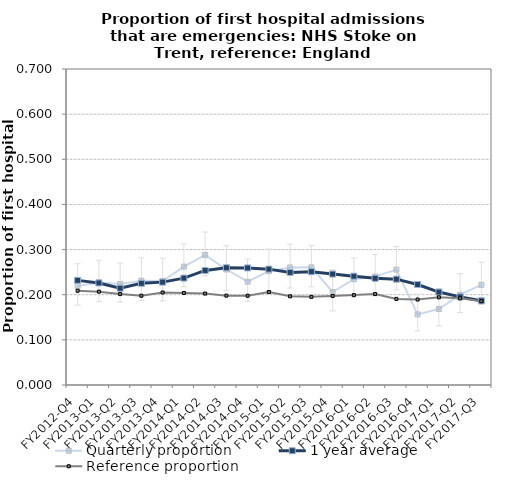
| Category | Quarterly proportion | 1 year average | Reference proportion |
|---|---|---|---|
| FY2012-Q4 | 0.219 | 0.232 | 0.209 |
| FY2013-Q1 | 0.227 | 0.226 | 0.207 |
| FY2013-Q2 | 0.224 | 0.214 | 0.201 |
| FY2013-Q3 | 0.231 | 0.225 | 0.198 |
| FY2013-Q4 | 0.23 | 0.228 | 0.205 |
| FY2014-Q1 | 0.262 | 0.237 | 0.204 |
| FY2014-Q2 | 0.288 | 0.254 | 0.203 |
| FY2014-Q3 | 0.256 | 0.26 | 0.198 |
| FY2014-Q4 | 0.229 | 0.259 | 0.198 |
| FY2015-Q1 | 0.252 | 0.257 | 0.206 |
| FY2015-Q2 | 0.26 | 0.249 | 0.196 |
| FY2015-Q3 | 0.261 | 0.251 | 0.195 |
| FY2015-Q4 | 0.206 | 0.246 | 0.197 |
| FY2016-Q1 | 0.234 | 0.241 | 0.199 |
| FY2016-Q2 | 0.24 | 0.236 | 0.201 |
| FY2016-Q3 | 0.256 | 0.234 | 0.191 |
| FY2016-Q4 | 0.156 | 0.223 | 0.189 |
| FY2017-Q1 | 0.168 | 0.206 | 0.194 |
| FY2017-Q2 | 0.2 | 0.195 | 0.192 |
| FY2017-Q3 | 0.222 | 0.187 | 0.185 |